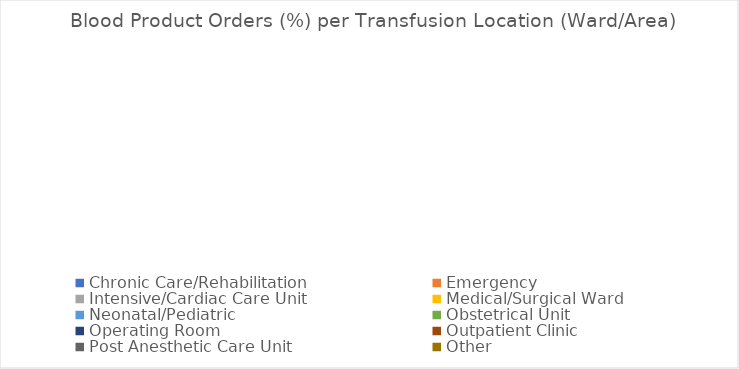
| Category | Series 0 | Series 1 |
|---|---|---|
| Chronic Care/Rehabilitation | 0 | 0 |
| Emergency | 0 | 0 |
| Intensive/Cardiac Care Unit | 0 | 0 |
| Medical/Surgical Ward | 0 | 0 |
| Neonatal/Pediatric | 0 | 0 |
| Obstetrical Unit | 0 | 0 |
| Operating Room | 0 | 0 |
| Outpatient Clinic | 0 | 0 |
| Post Anesthetic Care Unit | 0 | 0 |
| Other | 0 | 0 |